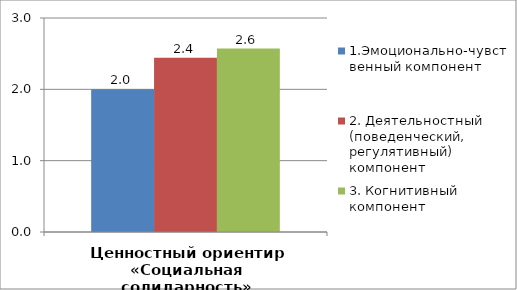
| Category | 1.Эмоционально-чувственный компонент | 2. Деятельностный (поведенческий, регулятивный) компонент | 3. Когнитивный компонент |
|---|---|---|---|
| Ценностный ориентир «Социальная солидарность» | 2 | 2.444 | 2.571 |